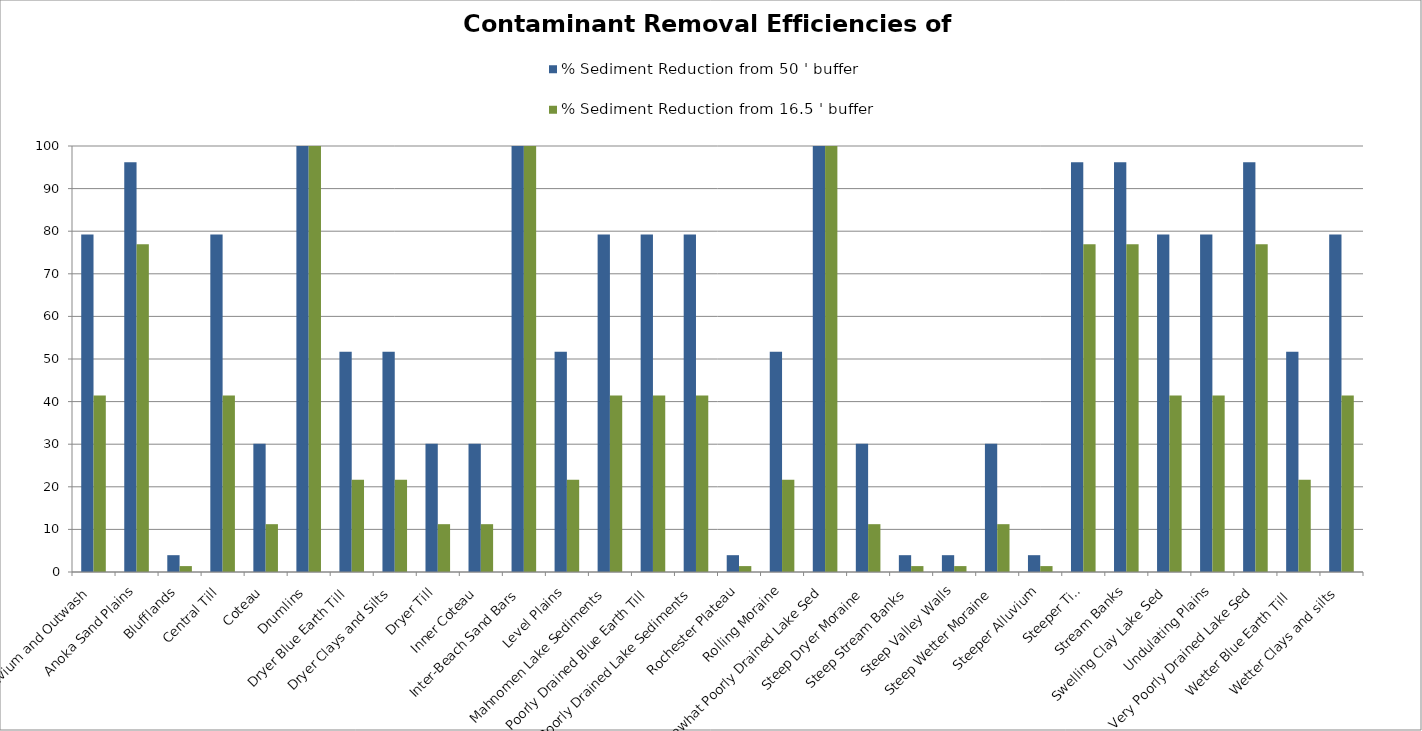
| Category | % Sediment Reduction from 50 ' buffer | % Sediment Reduction from 16.5 ' buffer |
|---|---|---|
| Alluvium and Outwash | 79.198 | 41.44 |
| Anoka Sand Plains | 96.185 | 76.942 |
| Blufflands | 3.947 | 1.386 |
| Central Till | 79.198 | 41.44 |
| Coteau | 30.101 | 11.227 |
| Drumlins | 100 | 100 |
| Dryer Blue Earth Till | 51.679 | 21.65 |
| Dryer Clays and Silts | 51.679 | 21.65 |
| Dryer Till | 30.101 | 11.227 |
| Inner Coteau | 30.101 | 11.227 |
| Inter-Beach Sand Bars | 100 | 100 |
| Level Plains | 51.679 | 21.65 |
| Mahnomen Lake Sediments | 79.198 | 41.44 |
| Poorly Drained Blue Earth Till | 79.198 | 41.44 |
| Poorly Drained Lake Sediments | 79.198 | 41.44 |
| Rochester Plateau | 3.947 | 1.386 |
| Rolling Moraine | 51.679 | 21.65 |
| Somewhat Poorly Drained Lake Sed | 100 | 100 |
| Steep Dryer Moraine | 30.101 | 11.227 |
| Steep Stream Banks | 3.947 | 1.386 |
| Steep Valley Walls | 3.947 | 1.386 |
| Steep Wetter Moraine | 30.101 | 11.227 |
| Steeper Alluvium | 3.947 | 1.386 |
| Steeper Till | 96.185 | 76.942 |
| Stream Banks | 96.185 | 76.942 |
| Swelling Clay Lake Sed | 79.198 | 41.44 |
| Undulating Plains | 79.198 | 41.44 |
| Very Poorly Drained Lake Sed | 96.185 | 76.942 |
| Wetter Blue Earth Till  | 51.679 | 21.65 |
| Wetter Clays and silts | 79.198 | 41.44 |